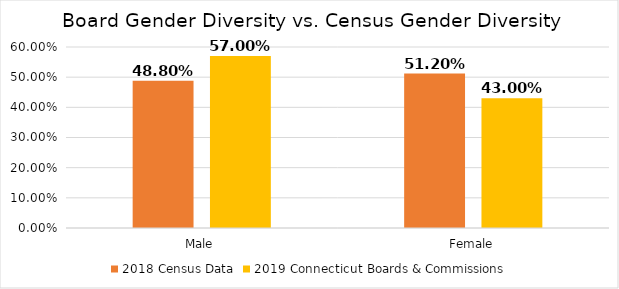
| Category | 2018 Census Data | 2019 Connecticut Boards & Commissions |
|---|---|---|
| Male | 0.488 | 0.57 |
| Female | 0.512 | 0.43 |